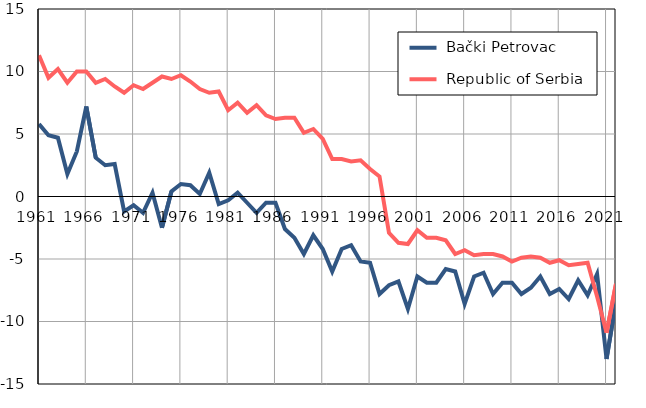
| Category |  Bački Petrovac |  Republic of Serbia |
|---|---|---|
| 1961.0 | 5.8 | 11.3 |
| 1962.0 | 4.9 | 9.5 |
| 1963.0 | 4.7 | 10.2 |
| 1964.0 | 1.8 | 9.1 |
| 1965.0 | 3.6 | 10 |
| 1966.0 | 7.2 | 10 |
| 1967.0 | 3.1 | 9.1 |
| 1968.0 | 2.5 | 9.4 |
| 1969.0 | 2.6 | 8.8 |
| 1970.0 | -1.2 | 8.3 |
| 1971.0 | -0.7 | 8.9 |
| 1972.0 | -1.3 | 8.6 |
| 1973.0 | 0.3 | 9.1 |
| 1974.0 | -2.5 | 9.6 |
| 1975.0 | 0.4 | 9.4 |
| 1976.0 | 1 | 9.7 |
| 1977.0 | 0.9 | 9.2 |
| 1978.0 | 0.2 | 8.6 |
| 1979.0 | 1.9 | 8.3 |
| 1980.0 | -0.6 | 8.4 |
| 1981.0 | -0.3 | 6.9 |
| 1982.0 | 0.3 | 7.5 |
| 1983.0 | -0.5 | 6.7 |
| 1984.0 | -1.3 | 7.3 |
| 1985.0 | -0.5 | 6.5 |
| 1986.0 | -0.5 | 6.2 |
| 1987.0 | -2.6 | 6.3 |
| 1988.0 | -3.3 | 6.3 |
| 1989.0 | -4.6 | 5.1 |
| 1990.0 | -3.1 | 5.4 |
| 1991.0 | -4.2 | 4.6 |
| 1992.0 | -6 | 3 |
| 1993.0 | -4.2 | 3 |
| 1994.0 | -3.9 | 2.8 |
| 1995.0 | -5.2 | 2.9 |
| 1996.0 | -5.3 | 2.2 |
| 1997.0 | -7.8 | 1.6 |
| 1998.0 | -7.1 | -2.9 |
| 1999.0 | -6.8 | -3.7 |
| 2000.0 | -9 | -3.8 |
| 2001.0 | -6.4 | -2.7 |
| 2002.0 | -6.9 | -3.3 |
| 2003.0 | -6.9 | -3.3 |
| 2004.0 | -5.8 | -3.5 |
| 2005.0 | -6 | -4.6 |
| 2006.0 | -8.6 | -4.3 |
| 2007.0 | -6.4 | -4.7 |
| 2008.0 | -6.1 | -4.6 |
| 2009.0 | -7.8 | -4.6 |
| 2010.0 | -6.9 | -4.8 |
| 2011.0 | -6.9 | -5.2 |
| 2012.0 | -7.8 | -4.9 |
| 2013.0 | -7.3 | -4.8 |
| 2014.0 | -6.4 | -4.9 |
| 2015.0 | -7.8 | -5.3 |
| 2016.0 | -7.4 | -5.1 |
| 2017.0 | -8.2 | -5.5 |
| 2018.0 | -6.7 | -5.4 |
| 2019.0 | -7.9 | -5.3 |
| 2020.0 | -6.2 | -8 |
| 2021.0 | -13 | -10.9 |
| 2022.0 | -8.4 | -7 |